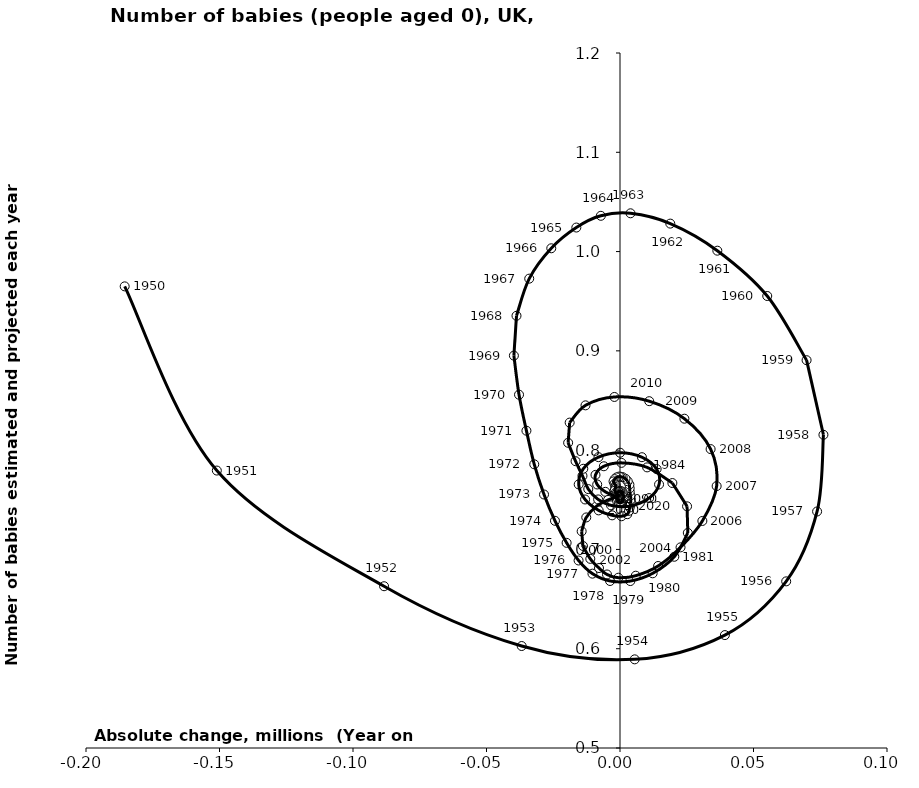
| Category | Series 0 |
|---|---|
| -0.18551300000000004 | 0.965 |
| -0.151003 | 0.779 |
| -0.088362 | 0.663 |
| -0.03682850000000004 | 0.603 |
| 0.005505999999999955 | 0.589 |
| 0.039281500000000025 | 0.614 |
| 0.06224600000000008 | 0.668 |
| 0.07381850000000001 | 0.738 |
| 0.07619349999999997 | 0.815 |
| 0.06988099999999997 | 0.891 |
| 0.055144499999999985 | 0.955 |
| 0.036455499999999974 | 1.001 |
| 0.018830000000000013 | 1.028 |
| 0.003932999999999964 | 1.039 |
| -0.007174000000000014 | 1.036 |
| -0.016355499999999967 | 1.024 |
| -0.02573599999999998 | 1.003 |
| -0.033996999999999944 | 0.973 |
| -0.03876600000000002 | 0.935 |
| -0.03974050000000001 | 0.895 |
| -0.03781849999999998 | 0.856 |
| -0.03504649999999998 | 0.82 |
| -0.03211599999999998 | 0.786 |
| -0.028456000000000037 | 0.755 |
| -0.02435650000000006 | 0.729 |
| -0.01999099999999998 | 0.707 |
| -0.01550849999999998 | 0.689 |
| -0.010318499999999953 | 0.676 |
| -0.003727000000000036 | 0.668 |
| 0.003868999999999956 | 0.668 |
| 0.01223600000000008 | 0.676 |
| 0.020338999999999996 | 0.693 |
| 0.025398499999999935 | 0.717 |
| 0.025119500000000017 | 0.743 |
| 0.019616500000000037 | 0.767 |
| 0.010156500000000013 | 0.783 |
| 0.0005614999999999926 | 0.787 |
| -0.006049500000000041 | 0.784 |
| -0.009178499999999978 | 0.775 |
| -0.008535999999999988 | 0.765 |
| -0.005489000000000022 | 0.758 |
| -0.0024279999999999857 | 0.754 |
| -0.0009834999999999705 | 0.753 |
| -0.0016660000000000008 | 0.752 |
| -0.004473500000000019 | 0.75 |
| -0.00880000000000003 | 0.744 |
| -0.012633000000000005 | 0.732 |
| -0.014361999999999986 | 0.718 |
| -0.013878999999999975 | 0.703 |
| -0.011121500000000006 | 0.69 |
| -0.00786600000000004 | 0.681 |
| -0.004872500000000002 | 0.675 |
| -0.000613499999999989 | 0.672 |
| 0.005906000000000022 | 0.674 |
| 0.014280000000000015 | 0.683 |
| 0.022673499999999958 | 0.702 |
| 0.030847999999999987 | 0.729 |
| 0.03619600000000006 | 0.764 |
| 0.033938000000000024 | 0.801 |
| 0.02412299999999995 | 0.832 |
| 0.01094649999999997 | 0.849 |
| -0.0020959999999999868 | 0.854 |
| -0.012915999999999983 | 0.845 |
| -0.01885500000000001 | 0.828 |
| -0.019428 | 0.807 |
| -0.016648499999999955 | 0.789 |
| -0.014055499999999999 | 0.774 |
| -0.011878000000000055 | 0.761 |
| -0.008186499999999985 | 0.75 |
| -0.003351999999999966 | 0.744 |
| 0.0036640000000000006 | 0.744 |
| 0.010900500000000035 | 0.752 |
| 0.014629999999999976 | 0.765 |
| 0.01372299999999993 | 0.781 |
| 0.008207999999999993 | 0.793 |
| 3.100000000000325e-05 | 0.797 |
| -0.008068499999999978 | 0.793 |
| -0.013745000000000007 | 0.781 |
| -0.015472500000000056 | 0.765 |
| -0.013079000000000007 | 0.75 |
| -0.007984999999999964 | 0.739 |
| -0.002947499999999992 | 0.734 |
| 0.0005824999999999858 | 0.733 |
| 0.002742000000000022 | 0.736 |
| 0.0033635000000000193 | 0.739 |
| 0.0036395000000000177 | 0.742 |
| 0.004016999999999993 | 0.746 |
| 0.004066999999999987 | 0.75 |
| 0.0039365000000000094 | 0.754 |
| 0.003645499999999968 | 0.758 |
| 0.0036225000000000285 | 0.762 |
| 0.0035235000000000127 | 0.765 |
| 0.0029015000000000013 | 0.769 |
| 0.0020595000000000474 | 0.771 |
| 0.0009984999999999578 | 0.773 |
| 0.0003109999999999502 | 0.773 |
| -0.0003195000000000281 | 0.773 |
| -0.0012849999999999806 | 0.773 |
| -0.0020084999999999686 | 0.771 |
| -0.0024259999999999837 | 0.769 |
| -0.0020344999999999946 | 0.766 |
| -0.001570999999999989 | 0.764 |
| -0.0016880000000000228 | 0.763 |
| -0.0018084999999999907 | 0.761 |
| -0.001975500000000019 | 0.759 |
| -0.0016059999999999963 | 0.757 |
| -0.0011284999999999767 | 0.756 |
| -0.0011395000000000155 | 0.755 |
| -0.0012359999999999594 | 0.754 |
| -0.0014440000000000008 | 0.752 |
| -0.0011765000000000247 | 0.751 |
| -0.0008095000000000185 | 0.75 |
| -0.0008480000000000154 | 0.749 |
| -0.0008164999999999978 | 0.748 |
| -0.0007260000000000044 | 0.748 |
| 3.650000000005038e-05 | 0.747 |
| 0.0008794999999999775 | 0.748 |
| 0.0010459999999999914 | 0.749 |
| 0.0009985000000000688 | 0.75 |
| 0.000749500000000014 | 0.751 |
| 0.0011019999999999919 | 0.751 |
| 0.0015169999999999906 | 0.753 |
| 0.0012619999999999854 | 0.754 |
| 0.0009184999999999888 | 0.755 |
| 0.0004804999999999948 | 0.756 |
| 0.0007090000000000152 | 0.756 |
| 0.0010199999999999654 | 0.758 |
| 0.0006549999999999612 | 0.758 |
| 0.00019350000000006862 | 0.759 |
| -0.0003795000000000326 | 0.759 |
| -0.000280000000000058 | 0.758 |
| -4.899999999996574e-05 | 0.758 |
| -0.0004309999999999592 | 0.758 |
| -0.0008369999999999767 | 0.757 |
| -0.0012765000000000137 | 0.756 |
| -0.0009465000000000168 | 0.755 |
| -0.0004574999999999996 | 0.754 |
| -0.0006515000000000271 | 0.754 |
| -0.0009469999999999756 | 0.753 |
| -0.0013434999999999975 | 0.752 |
| -0.0009460000000000579 | 0.75 |
| -0.0003854999999999831 | 0.75 |
| -0.0005349999999999522 | 0.75 |
| -0.0007449999999999957 | 0.749 |
| -0.0010180000000000189 | 0.748 |
| -0.00040050000000002584 | 0.747 |
| 0.00037799999999998946 | 0.747 |
| 0.00035000000000001696 | 0.748 |
| 0.00023250000000002435 | 0.748 |
| 2.6999999999999247e-05 | 0.748 |